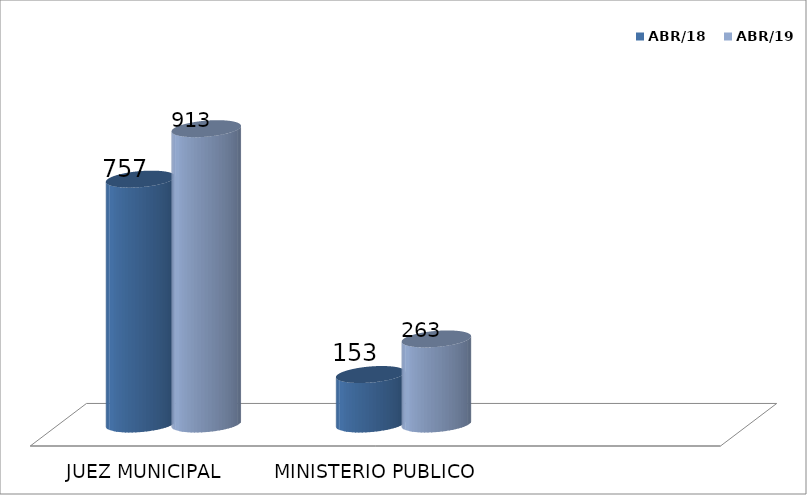
| Category | ABR/18 | ABR/19 |
|---|---|---|
| JUEZ MUNICIPAL | 757 | 913 |
| MINISTERIO PUBLICO | 153 | 263 |